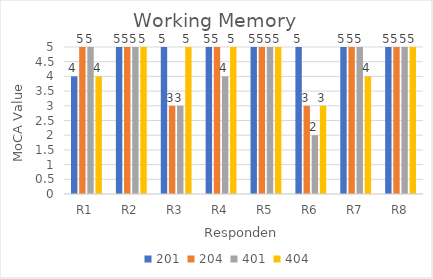
| Category | 201 | 204 | 401 | 404 |
|---|---|---|---|---|
| R1 | 4 | 5 | 5 | 4 |
| R2 | 5 | 5 | 5 | 5 |
| R3 | 5 | 3 | 3 | 5 |
| R4 | 5 | 5 | 4 | 5 |
| R5 | 5 | 5 | 5 | 5 |
| R6 | 5 | 3 | 2 | 3 |
| R7 | 5 | 5 | 5 | 4 |
| R8 | 5 | 5 | 5 | 5 |